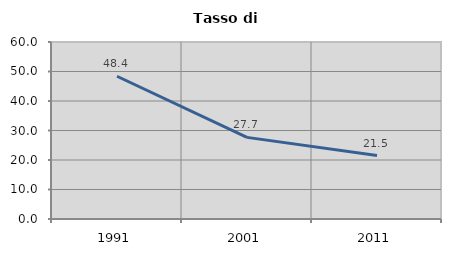
| Category | Tasso di disoccupazione   |
|---|---|
| 1991.0 | 48.387 |
| 2001.0 | 27.671 |
| 2011.0 | 21.508 |